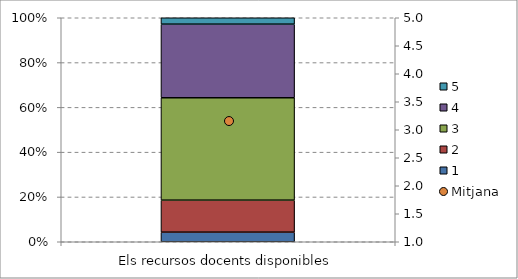
| Category | 1 | 2 | 3 | 4 | 5 |
|---|---|---|---|---|---|
| Els recursos docents disponibles | 3 | 10 | 32 | 23 | 2 |